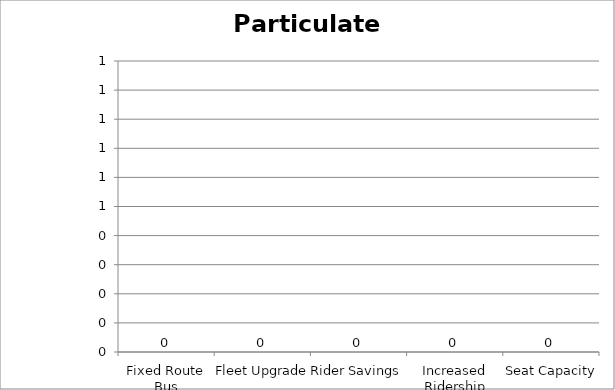
| Category | Particulate Matter |
|---|---|
| Fixed Route Bus | 0 |
| Fleet Upgrade | 0 |
| Rider Savings | 0 |
| Increased Ridership | 0 |
| Seat Capacity | 0 |